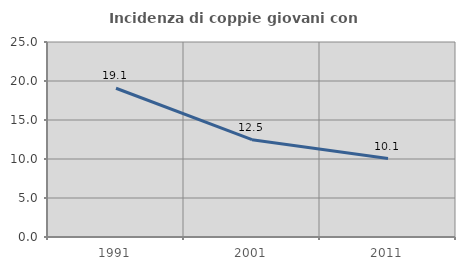
| Category | Incidenza di coppie giovani con figli |
|---|---|
| 1991.0 | 19.071 |
| 2001.0 | 12.48 |
| 2011.0 | 10.06 |